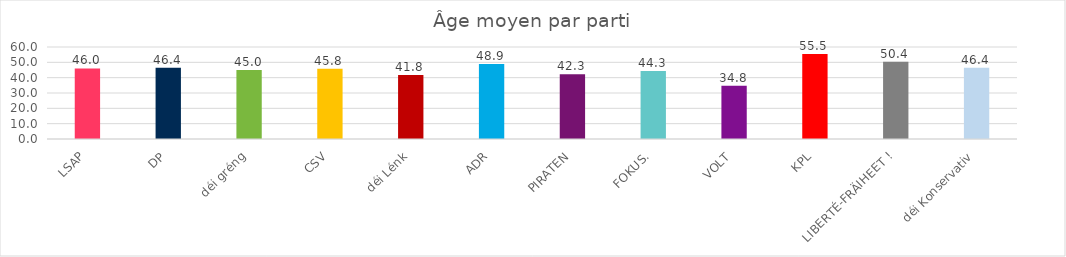
| Category | Âge moyen |
|---|---|
| LSAP | 46 |
| DP | 46.4 |
| déi gréng | 45 |
| CSV | 45.8 |
| déi Lénk | 41.8 |
| ADR | 48.9 |
| PIRATEN | 42.3 |
| FOKUS. | 44.3 |
| VOLT | 34.8 |
| KPL | 55.5 |
| LIBERTÉ-FRÄIHEET ! | 50.4 |
| déi Konservativ | 46.4 |